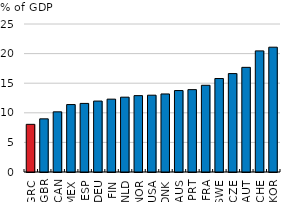
| Category | 2021 |
|---|---|
| GRC | 8.052 |
| GBR | 8.981 |
| CAN | 10.162 |
| MEX | 11.393 |
| ESP | 11.584 |
| DEU | 11.981 |
| FIN | 12.307 |
| NLD | 12.638 |
| NOR | 12.901 |
| USA | 12.974 |
| DNK | 13.183 |
| AUS | 13.759 |
| PRT | 13.913 |
| FRA | 14.648 |
| SWE | 15.79 |
| CZE | 16.624 |
| AUT | 17.677 |
| CHE | 20.458 |
| KOR | 21.081 |